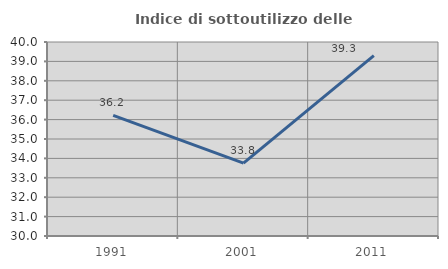
| Category | Indice di sottoutilizzo delle abitazioni  |
|---|---|
| 1991.0 | 36.218 |
| 2001.0 | 33.754 |
| 2011.0 | 39.302 |